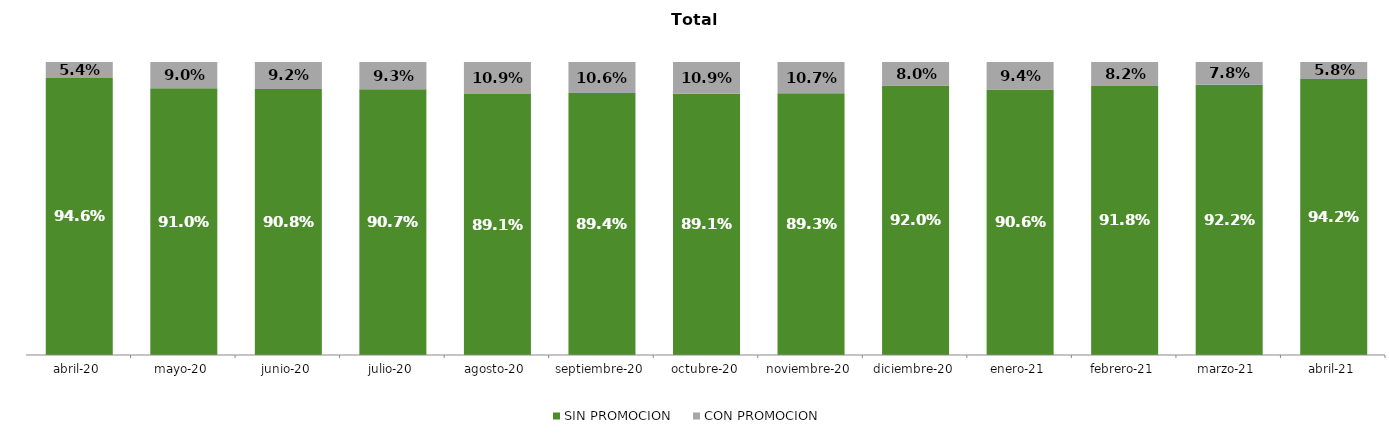
| Category | SIN PROMOCION   | CON PROMOCION   |
|---|---|---|
| 2020-04-01 | 0.946 | 0.054 |
| 2020-05-01 | 0.91 | 0.09 |
| 2020-06-01 | 0.908 | 0.092 |
| 2020-07-01 | 0.907 | 0.093 |
| 2020-08-01 | 0.891 | 0.109 |
| 2020-09-01 | 0.894 | 0.106 |
| 2020-10-01 | 0.891 | 0.109 |
| 2020-11-01 | 0.893 | 0.107 |
| 2020-12-01 | 0.92 | 0.08 |
| 2021-01-01 | 0.906 | 0.094 |
| 2021-02-01 | 0.918 | 0.082 |
| 2021-03-01 | 0.922 | 0.078 |
| 2021-04-01 | 0.942 | 0.058 |